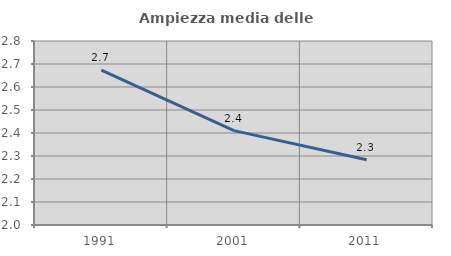
| Category | Ampiezza media delle famiglie |
|---|---|
| 1991.0 | 2.673 |
| 2001.0 | 2.41 |
| 2011.0 | 2.284 |